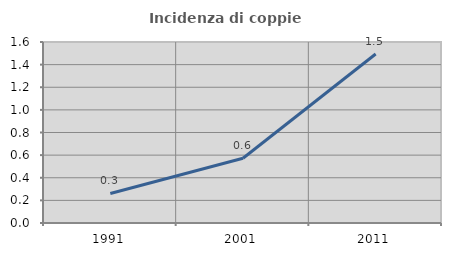
| Category | Incidenza di coppie miste |
|---|---|
| 1991.0 | 0.261 |
| 2001.0 | 0.572 |
| 2011.0 | 1.494 |